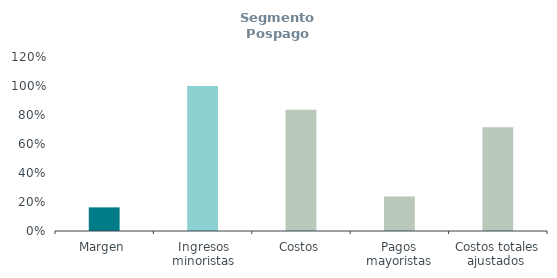
| Category | Segmento Pospago
(% ingresos) |
|---|---|
| Margen | 0.163 |
| Ingresos minoristas | 1 |
| Costos | 0.837 |
| Pagos mayoristas | 0.238 |
| Costos totales ajustados  | 0.716 |